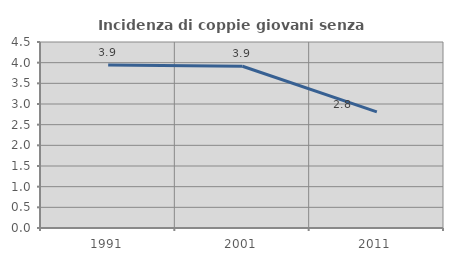
| Category | Incidenza di coppie giovani senza figli |
|---|---|
| 1991.0 | 3.941 |
| 2001.0 | 3.912 |
| 2011.0 | 2.81 |